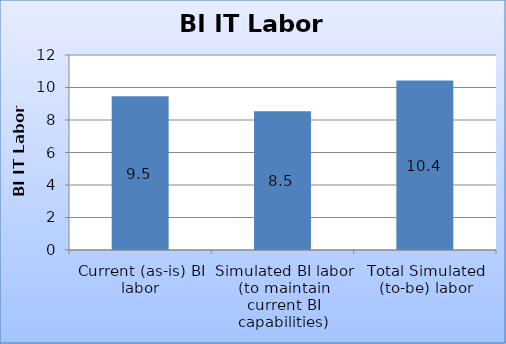
| Category | FTEs |
|---|---|
| Current (as-is) BI labor | 9.467 |
| Simulated BI labor (to maintain current BI capabilities) | 8.539 |
| Total Simulated (to-be) labor | 10.424 |